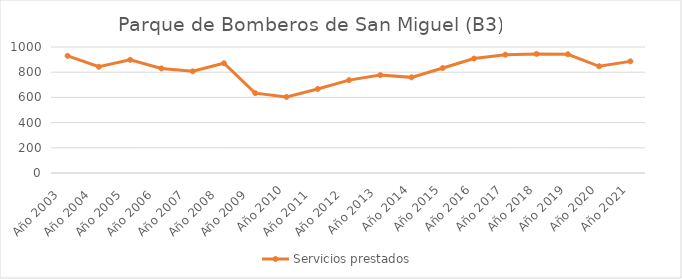
| Category | Servicios prestados  |
|---|---|
| Año 2003   | 930 |
| Año 2004   | 843 |
| Año 2005   | 898 |
| Año 2006   | 830 |
| Año 2007   | 807 |
| Año 2008   | 871 |
| Año 2009   | 634 |
| Año 2010 | 604 |
| Año 2011   | 667 |
| Año 2012   | 737 |
| Año 2013  | 777 |
| Año 2014 | 759 |
| Año 2015 | 833 |
| Año 2016 | 908 |
| Año 2017 | 939 |
| Año 2018 | 945 |
| Año 2019 | 942 |
| Año 2020 | 847 |
| Año 2021 | 886 |